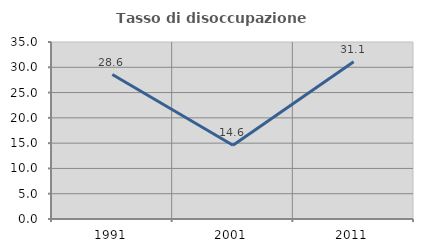
| Category | Tasso di disoccupazione giovanile  |
|---|---|
| 1991.0 | 28.571 |
| 2001.0 | 14.583 |
| 2011.0 | 31.081 |